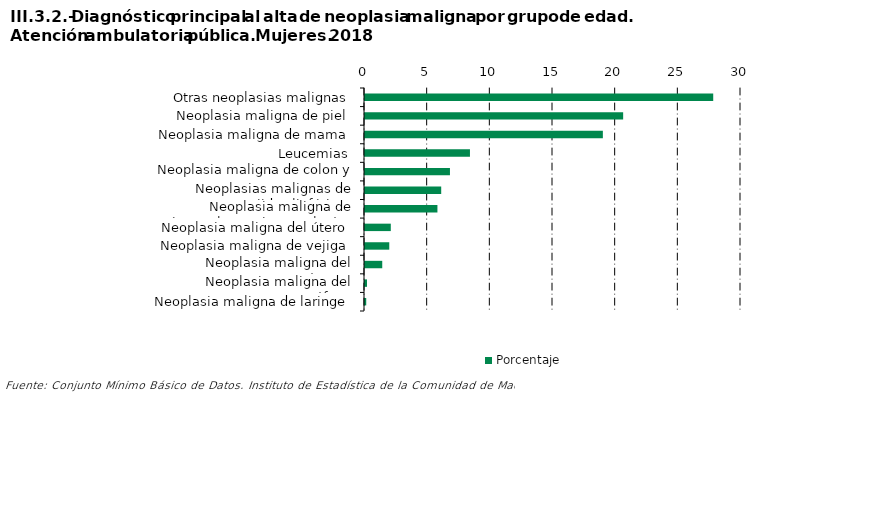
| Category | Porcentaje |
|---|---|
| Otras neoplasias malignas | 27.783 |
| Neoplasia maligna de piel | 20.597 |
| Neoplasia maligna de mama | 18.978 |
| Leucemias | 8.374 |
| Neoplasia maligna de colon y recto | 6.778 |
| Neoplasias malignas de tejidos linfáticos | 6.08 |
| Neoplasia maligna de tráquea, bronquios y pulmón | 5.779 |
| Neoplasia maligna del útero | 2.058 |
| Neoplasia maligna de vejiga | 1.937 |
| Neoplasia maligna del estómago | 1.376 |
| Neoplasia maligna del esófago | 0.161 |
| Neoplasia maligna de laringe | 0.098 |